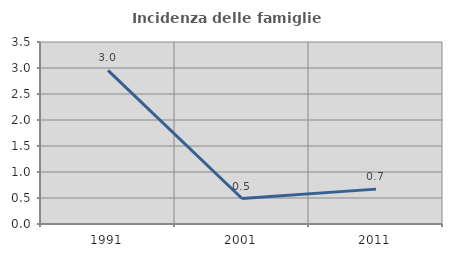
| Category | Incidenza delle famiglie numerose |
|---|---|
| 1991.0 | 2.955 |
| 2001.0 | 0.49 |
| 2011.0 | 0.671 |